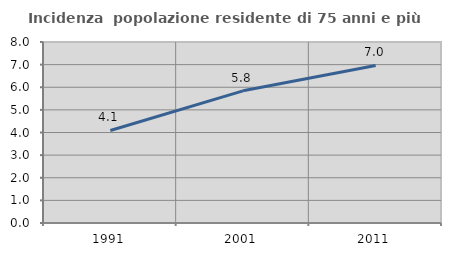
| Category | Incidenza  popolazione residente di 75 anni e più |
|---|---|
| 1991.0 | 4.09 |
| 2001.0 | 5.841 |
| 2011.0 | 6.964 |